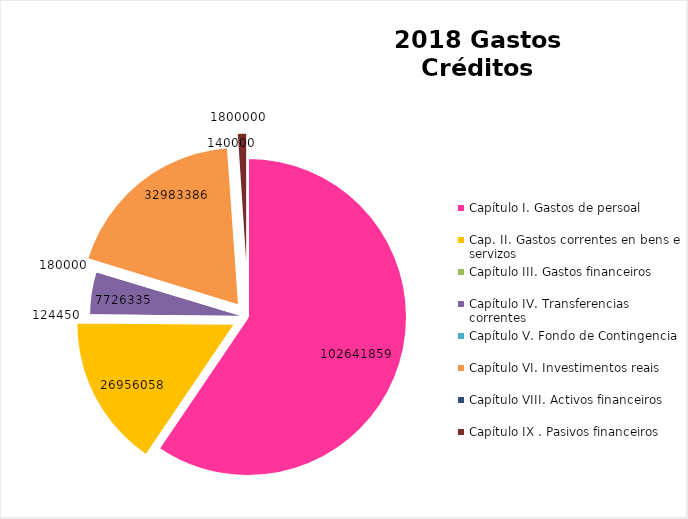
| Category | Series 0 |
|---|---|
| Capítulo I. Gastos de persoal | 102641859 |
| Cap. II. Gastos correntes en bens e servizos | 26956058 |
| Capítulo III. Gastos financeiros | 124450 |
| Capítulo IV. Transferencias correntes | 7726335 |
| Capítulo V. Fondo de Contingencia | 180000 |
| Capítulo VI. Investimentos reais | 32983386 |
| Capítulo VIII. Activos financeiros | 140000 |
| Capítulo IX . Pasivos financeiros | 1800000 |